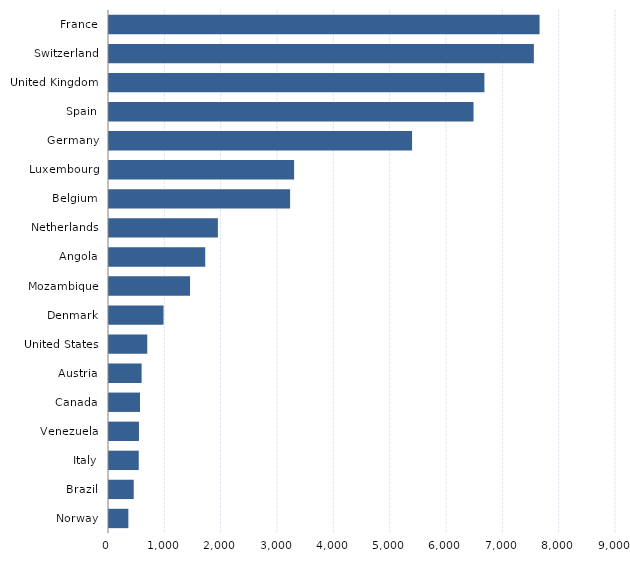
| Category | Series 0 |
|---|---|
| Norway | 344 |
| Brazil | 439 |
| Italy | 528 |
| Venezuela | 532 |
| Canada | 550 |
| Austria | 579 |
| United States | 679 |
| Denmark | 968 |
| Mozambique | 1439 |
| Angola | 1708 |
| Netherlands | 1933 |
| Belgium | 3215 |
| Luxembourg | 3286 |
| Germany | 5380 |
| Spain | 6471 |
| United Kingdom | 6664 |
| Switzerland | 7542 |
| France | 7643 |